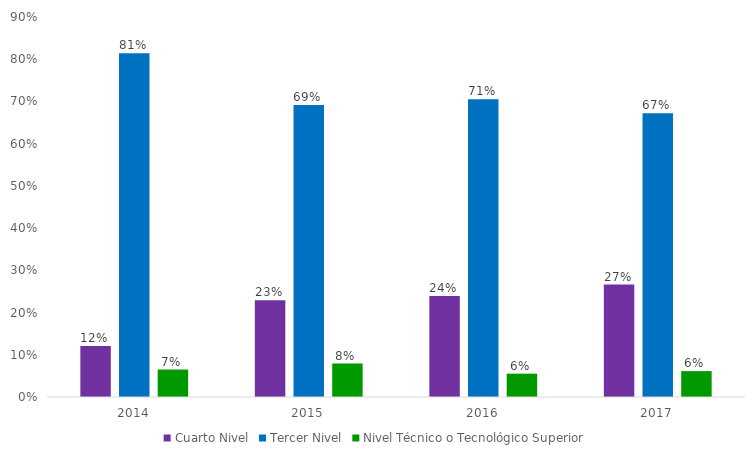
| Category | Cuarto Nivel | Tercer Nivel | Nivel Técnico o Tecnológico Superior |
|---|---|---|---|
| 2014.0 | 0.121 | 0.814 | 0.065 |
| 2015.0 | 0.229 | 0.692 | 0.079 |
| 2016.0 | 0.239 | 0.705 | 0.055 |
| 2017.0 | 0.266 | 0.672 | 0.061 |